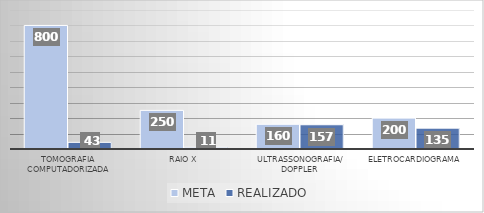
| Category | META | REALIZADO |
|---|---|---|
| Tomografia computadorizada | 800 | 43 |
| Raio x | 250 | 11 |
| Ultrassonografia/ Doppler  | 160 | 157 |
| Eletrocardiograma | 200 | 135 |